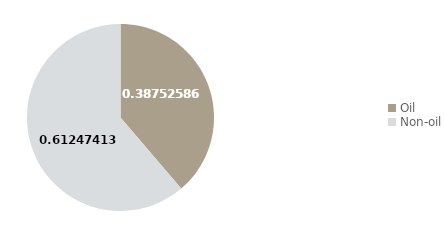
| Category | Q1 2018 |
|---|---|
| Oil | 38.753 |
| Non-oil | 61.247 |